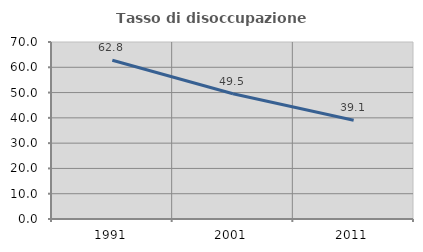
| Category | Tasso di disoccupazione giovanile  |
|---|---|
| 1991.0 | 62.791 |
| 2001.0 | 49.524 |
| 2011.0 | 39.08 |